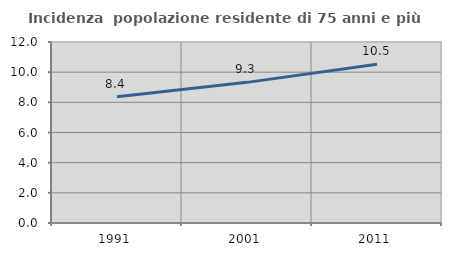
| Category | Incidenza  popolazione residente di 75 anni e più |
|---|---|
| 1991.0 | 8.366 |
| 2001.0 | 9.324 |
| 2011.0 | 10.525 |